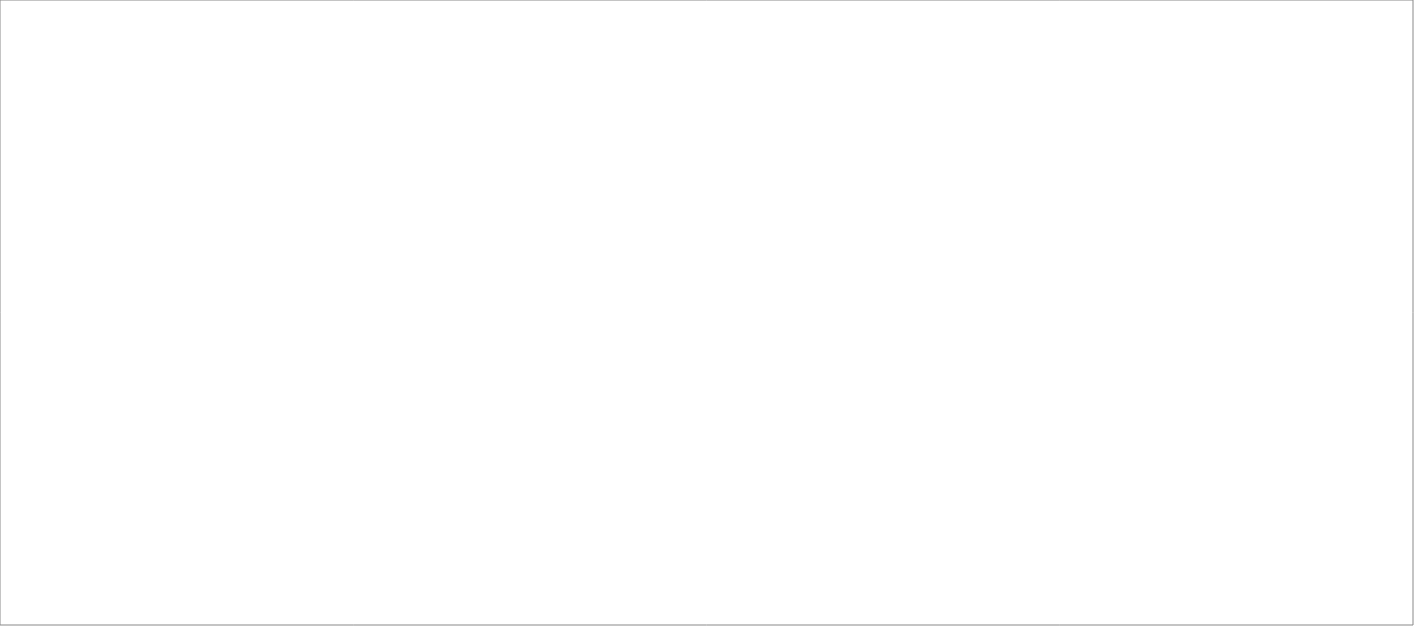
| Category | Total |
|---|---|
| Poolia Sverige AB | 85 |
| Randstad AB | 80 |
| Experis AB | 56 |
| Signpost AB | 25 |
| Source Executive Recruitment Sweden AB | 25 |